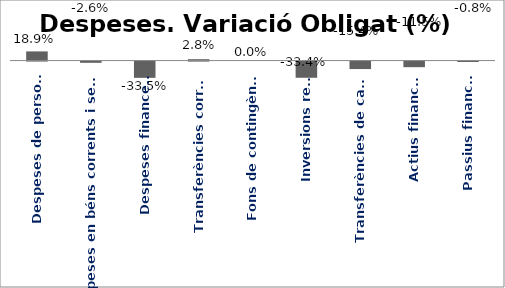
| Category | Series 0 |
|---|---|
| Despeses de personal | 0.189 |
| Despeses en béns corrents i serveis | -0.026 |
| Despeses financeres | -0.335 |
| Transferències corrents | 0.028 |
| Fons de contingència | 0 |
| Inversions reals | -0.334 |
| Transferències de capital | -0.154 |
| Actius financers | -0.115 |
| Passius financers | -0.008 |